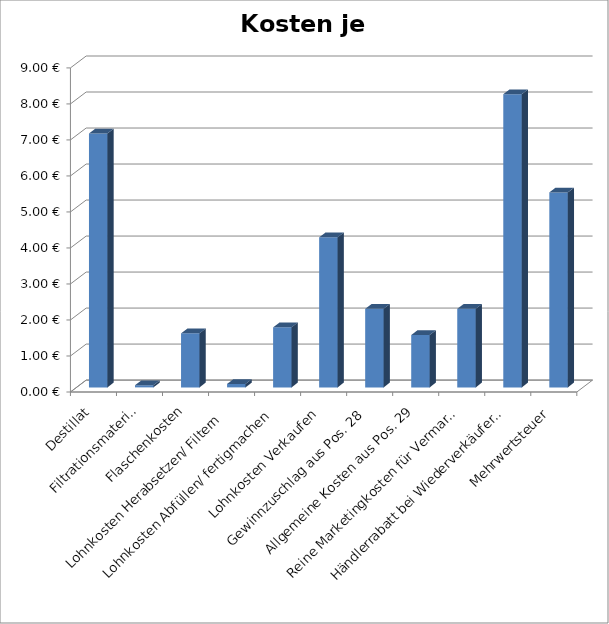
| Category | Kosten je Flasche |
|---|---|
| Destillat | 7.052 |
| Filtrationsmaterial | 0.06 |
| Flaschenkosten | 1.5 |
| Lohnkosten Herabsetzen/ Filtern  | 0.095 |
| Lohnkosten Abfüllen/ fertigmachen | 1.667 |
| Lohnkosten Verkaufen | 4.167 |
| Gewinnzuschlag aus Pos. 28 | 2.181 |
| Allgemeine Kosten aus Pos. 29 | 1.454 |
| Reine Marketingkosten für Vermarktung Pos.30 | 2.181 |
| Händlerrabatt bei Wiederverkäufer Pos 31 | 8.143 |
| Mehrwertsteuer | 5.415 |